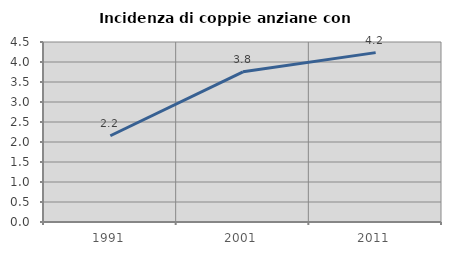
| Category | Incidenza di coppie anziane con figli |
|---|---|
| 1991.0 | 2.156 |
| 2001.0 | 3.754 |
| 2011.0 | 4.234 |